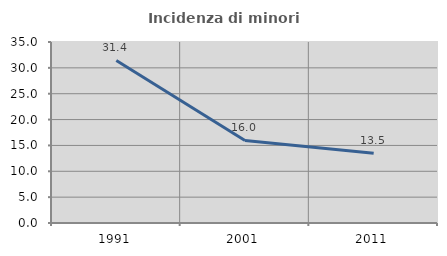
| Category | Incidenza di minori stranieri |
|---|---|
| 1991.0 | 31.429 |
| 2001.0 | 15.957 |
| 2011.0 | 13.505 |